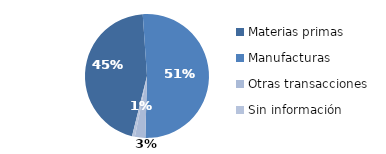
| Category | Series 0 |
|---|---|
| Materias primas | 699.283 |
| Manufacturas | 800.235 |
| Otras transacciones | 42.257 |
| Sin información | 11.71 |